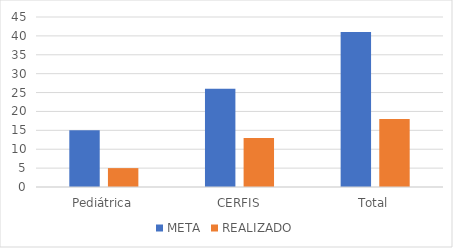
| Category | META | REALIZADO |
|---|---|---|
| Pediátrica | 15 | 5 |
| CERFIS | 26 | 13 |
| Total | 41 | 18 |